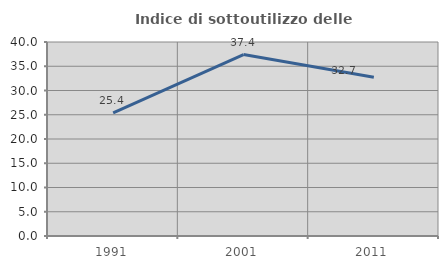
| Category | Indice di sottoutilizzo delle abitazioni  |
|---|---|
| 1991.0 | 25.385 |
| 2001.0 | 37.403 |
| 2011.0 | 32.743 |